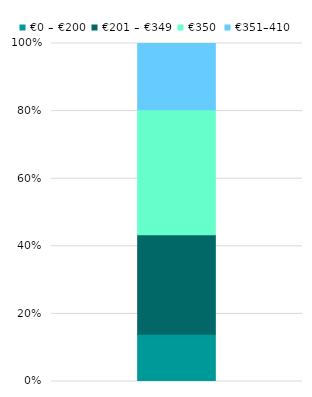
| Category | €0 – €200 | €201 – €349 | €350 | €351–410 |
|---|---|---|---|---|
| 0 | 0.14 | 0.294 | 0.37 | 0.197 |